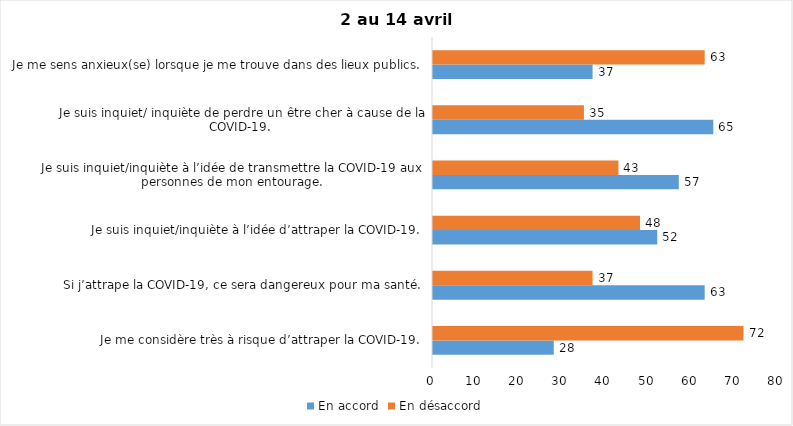
| Category | En accord | En désaccord |
|---|---|---|
| Je me considère très à risque d’attraper la COVID-19. | 28 | 72 |
| Si j’attrape la COVID-19, ce sera dangereux pour ma santé. | 63 | 37 |
| Je suis inquiet/inquiète à l’idée d’attraper la COVID-19. | 52 | 48 |
| Je suis inquiet/inquiète à l’idée de transmettre la COVID-19 aux personnes de mon entourage. | 57 | 43 |
| Je suis inquiet/ inquiète de perdre un être cher à cause de la COVID-19. | 65 | 35 |
| Je me sens anxieux(se) lorsque je me trouve dans des lieux publics. | 37 | 63 |